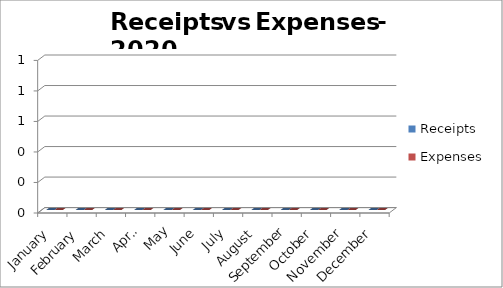
| Category | Receipts | Expenses |
|---|---|---|
| 0 | 0 | 0 |
| 1 | 0 | 0 |
| 2 | 0 | 0 |
| 3 | 0 | 0 |
| 4 | 0 | 0 |
| 5 | 0 | 0 |
| 6 | 0 | 0 |
| 7 | 0 | 0 |
| 8 | 0 | 0 |
| 9 | 0 | 0 |
| 10 | 0 | 0 |
| 11 | 0 | 0 |